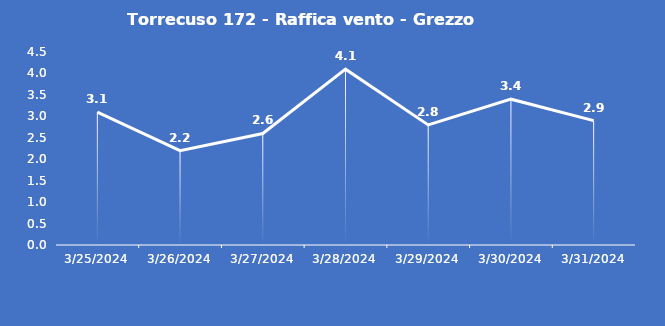
| Category | Torrecuso 172 - Raffica vento - Grezzo (m/s) |
|---|---|
| 3/25/24 | 3.1 |
| 3/26/24 | 2.2 |
| 3/27/24 | 2.6 |
| 3/28/24 | 4.1 |
| 3/29/24 | 2.8 |
| 3/30/24 | 3.4 |
| 3/31/24 | 2.9 |